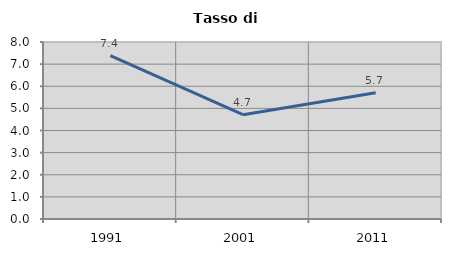
| Category | Tasso di disoccupazione   |
|---|---|
| 1991.0 | 7.381 |
| 2001.0 | 4.715 |
| 2011.0 | 5.71 |